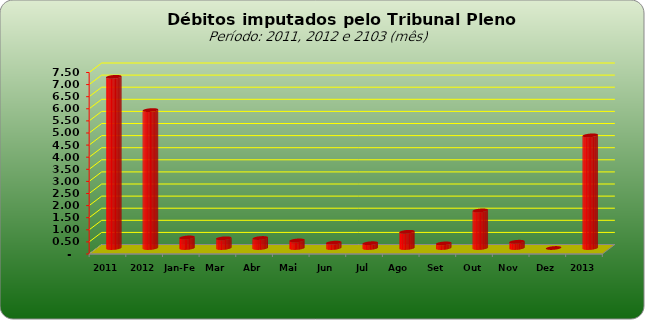
| Category |  7.073.154,74   5.698.720,25   436.112,79   401.482,76   413.229,26   313.253,71   220.510,24   197.835,92   670.047,46   189.705,54   1.552.892,31   258.515,72   -     4.653.585,71  |
|---|---|
| 2011 | 7073154.74 |
| 2012 | 5698720.25 |
| Jan-Fev | 436112.79 |
| Mar | 401482.76 |
| Abr | 413229.26 |
| Mai | 313253.71 |
| Jun | 220510.24 |
| Jul | 197835.92 |
| Ago | 670047.46 |
| Set | 189705.54 |
| Out | 1552892.31 |
| Nov | 258515.72 |
| Dez | 0 |
| 2013 | 4653585.71 |